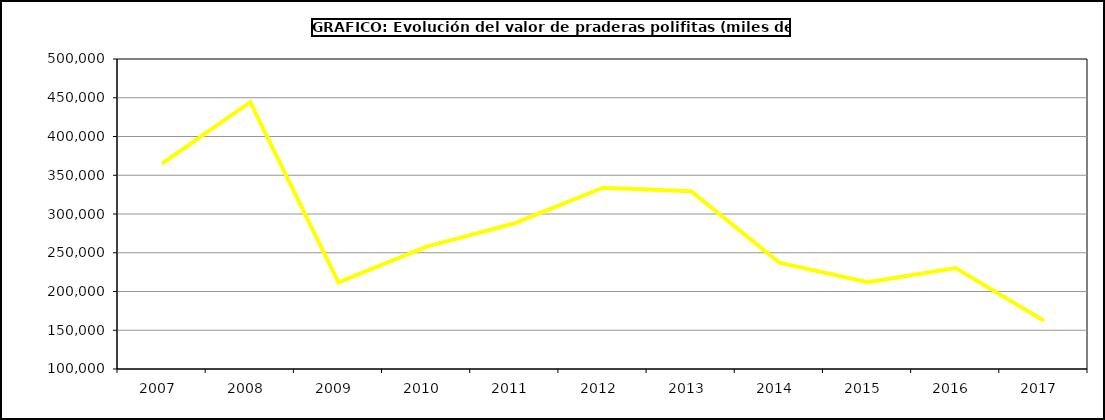
| Category | Valor |
|---|---|
| 2007.0 | 364940.217 |
| 2008.0 | 444361.431 |
| 2009.0 | 211697.199 |
| 2010.0 | 257899.036 |
| 2011.0 | 288090.963 |
| 2012.0 | 333939.944 |
| 2013.0 | 329402.741 |
| 2014.0 | 237285.995 |
| 2015.0 | 212093 |
| 2016.0 | 230171 |
| 2017.0 | 162246.482 |